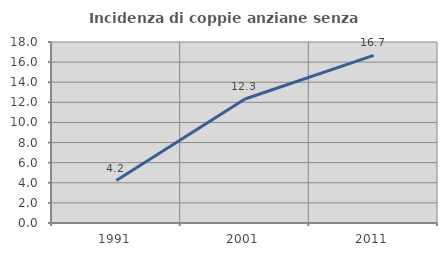
| Category | Incidenza di coppie anziane senza figli  |
|---|---|
| 1991.0 | 4.225 |
| 2001.0 | 12.329 |
| 2011.0 | 16.667 |